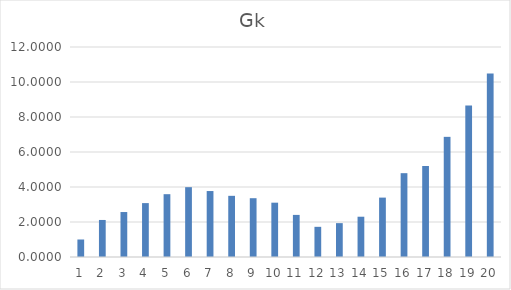
| Category | Gk |
|---|---|
| 0 | 1 |
| 1 | 2.116 |
| 2 | 2.57 |
| 3 | 3.08 |
| 4 | 3.59 |
| 5 | 3.99 |
| 6 | 3.769 |
| 7 | 3.495 |
| 8 | 3.36 |
| 9 | 3.104 |
| 10 | 2.406 |
| 11 | 1.724 |
| 12 | 1.935 |
| 13 | 2.301 |
| 14 | 3.394 |
| 15 | 4.79 |
| 16 | 5.2 |
| 17 | 6.866 |
| 18 | 8.656 |
| 19 | 10.483 |